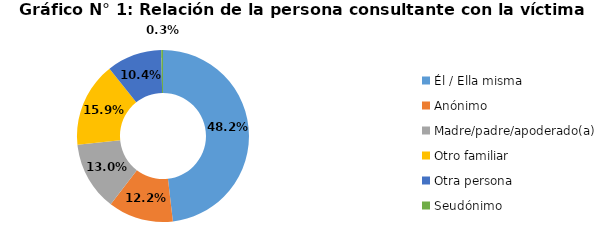
| Category | Series 0 |
|---|---|
| Él / Ella misma | 91525 |
| Anónimo | 23247 |
| Madre/padre/apoderado(a) | 24688 |
| Otro familiar | 30250 |
| Otra persona | 19682 |
| Seudónimo | 626 |